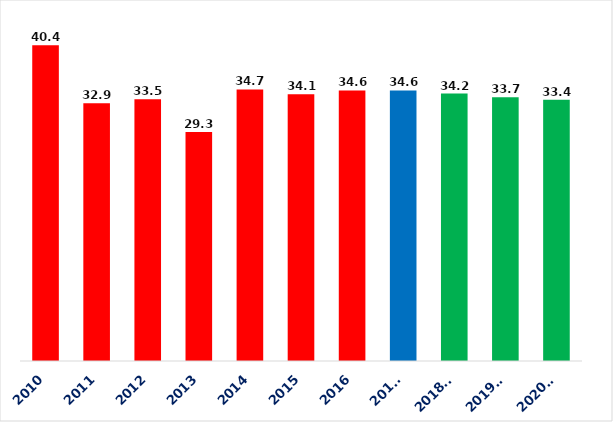
| Category | გადასახდელები წილი მშპ-სთან (%) |
|---|---|
| 2010 | 40.382 |
| 2011 | 32.94 |
| 2012 | 33.477 |
| 2013 | 29.269 |
| 2014 | 34.719 |
| 2015 | 34.102 |
| 2016 | 34.591 |
| 2017* | 34.587 |
| 2018** | 34.193 |
| 2019** | 33.726 |
| 2020** | 33.407 |